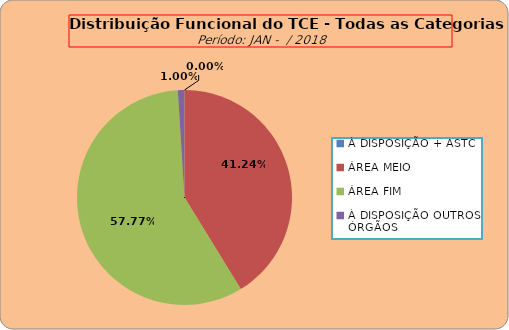
| Category | Series 0 |
|---|---|
| À DISPOSIÇÃO + ASTC | 0 |
| ÁREA MEIO | 207 |
| ÁREA FIM | 290 |
| À DISPOSIÇÃO OUTROS ÓRGÃOS | 5 |